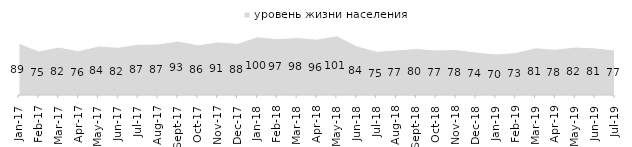
| Category | уровень жизни населения |
|---|---|
| 2017-01-01 | 88.55 |
| 2017-02-01 | 75.45 |
| 2017-03-01 | 82.1 |
| 2017-04-01 | 75.7 |
| 2017-05-01 | 83.85 |
| 2017-06-01 | 81.75 |
| 2017-07-01 | 86.95 |
| 2017-08-01 | 87.25 |
| 2017-09-01 | 92.5 |
| 2017-10-01 | 85.9 |
| 2017-11-01 | 90.75 |
| 2017-12-01 | 88.4 |
| 2018-01-01 | 99.6 |
| 2018-02-01 | 96.5 |
| 2018-03-01 | 98.45 |
| 2018-04-01 | 95.55 |
| 2018-05-01 | 101.45 |
| 2018-06-01 | 84.2 |
| 2018-07-01 | 74.9 |
| 2018-08-01 | 77.1 |
| 2018-09-01 | 79.6 |
| 2018-10-01 | 77.1 |
| 2018-11-01 | 77.745 |
| 2018-12-01 | 73.6 |
| 2019-01-01 | 70.25 |
| 2019-02-01 | 72.55 |
| 2019-03-01 | 80.806 |
| 2019-04-01 | 78.168 |
| 2019-05-01 | 82.169 |
| 2019-06-01 | 80.648 |
| 2019-07-01 | 76.881 |